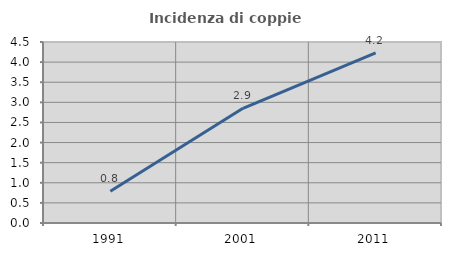
| Category | Incidenza di coppie miste |
|---|---|
| 1991.0 | 0.79 |
| 2001.0 | 2.853 |
| 2011.0 | 4.228 |